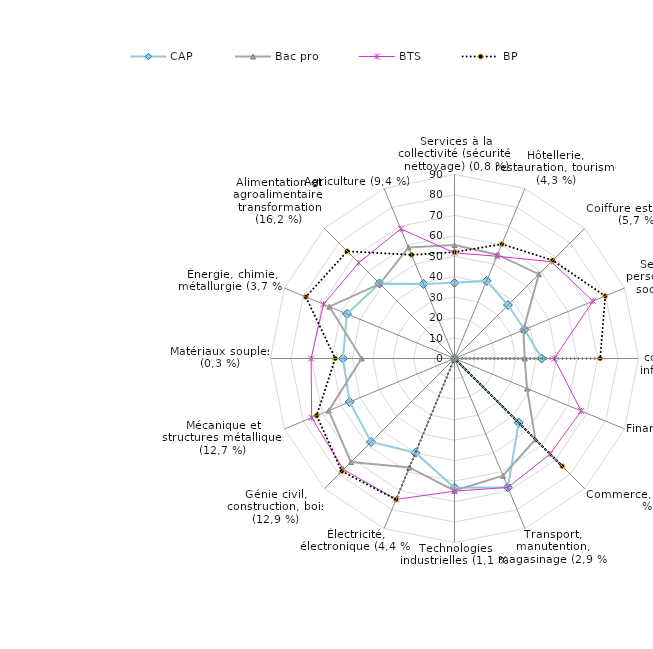
| Category | CAP | Bac pro | BTS | BP |
|---|---|---|---|---|
| Services à la collectivité (sécurité, nettoyage) (0,8 %) | 37 | 55.56 | 51.68 | 52.03 |
| Hôtellerie, restauration, tourisme (4,3 %) | 41.09 | 54.97 | 54.14 | 60.55 |
| Coiffure esthétique (5,7 %) | 36.98 | 58.33 | 66.97 | 67.92 |
| Services aux personnes (santé, social) (9,1 %) | 37.09 | 36.47 | 73.32 | 79.81 |
| Secrétariat, communication et information (2,6 %) | 42.61 | 34.34 | 48.77 | 71.25 |
| Finances, comptabilité (3,3 %) | 0 | 38.41 | 67.09 | 0 |
| Commerce, vente (10,5 %) | 44.44 | 55.95 | 66.11 | 74.51 |
| Transport, manutention, magasinage (2,9 %) | 68.2 | 62.05 | 68.25 | 0 |
| Technologies industrielles (1,1 %) | 63.16 | 64.66 | 64.9 | 0 |
| Électricité, électronique (4,4 %) | 49.89 | 57.7 | 74.59 | 74.65 |
| Génie civil, construction, bois (12,9 %) | 57.69 | 71.64 | 76.81 | 77.98 |
| Mécanique et structures métalliques (12,7 %) | 55.51 | 66.6 | 75.62 | 72.98 |
| Matériaux souples (0,3 %) | 54.59 | 45.45 | 70.13 | 58.33 |
| Énergie, chimie, métallurgie (3,7 %) | 56.94 | 66.21 | 69.35 | 78.71 |
| Alimentation et agroalimentaire, transformation (16,2 %) | 51.93 | 51.68 | 66.2 | 74.2 |
| Agriculture (9,4 %) | 39.49 | 58.79 | 68.62 | 54.87 |